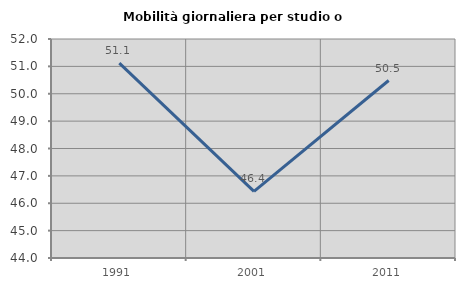
| Category | Mobilità giornaliera per studio o lavoro |
|---|---|
| 1991.0 | 51.119 |
| 2001.0 | 46.432 |
| 2011.0 | 50.483 |